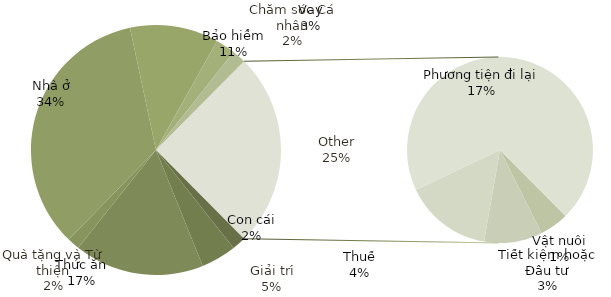
| Category | Tổng |
|---|---|
| Con cái | 2912000 |
| Giải trí | 7446400 |
| Thức ăn | 27456000 |
| Quà tặng và Từ thiện | 2600000 |
| Nhà ở | 56201600 |
| Bảo hiểm | 18720000 |
| Vay | 4160000 |
| Chăm sóc Cá nhân | 2912000 |
| Vật nuôi | 2080000 |
| Tiết kiệm hoặc Đầu tư | 4160000 |
| Thuế | 6240000 |
| Phương tiện đi lại | 28600000 |